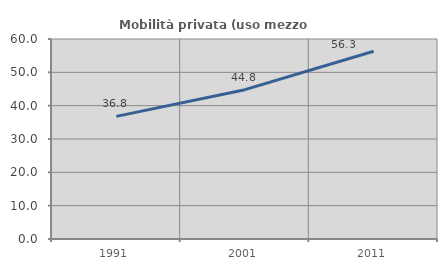
| Category | Mobilità privata (uso mezzo privato) |
|---|---|
| 1991.0 | 36.782 |
| 2001.0 | 44.794 |
| 2011.0 | 56.306 |